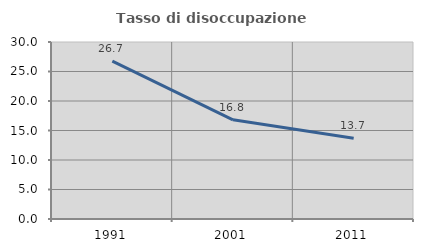
| Category | Tasso di disoccupazione giovanile  |
|---|---|
| 1991.0 | 26.744 |
| 2001.0 | 16.807 |
| 2011.0 | 13.699 |